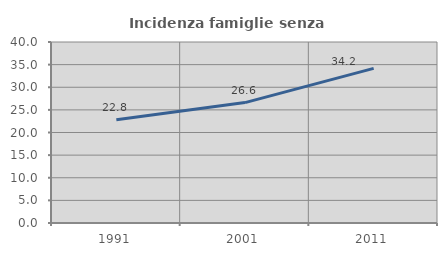
| Category | Incidenza famiglie senza nuclei |
|---|---|
| 1991.0 | 22.819 |
| 2001.0 | 26.613 |
| 2011.0 | 34.177 |